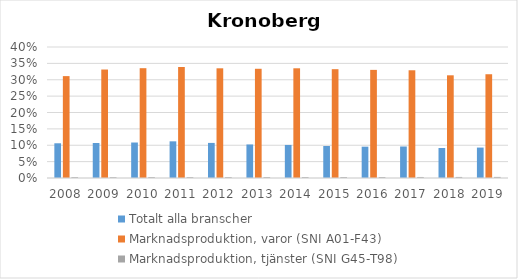
| Category | Totalt alla branscher | Marknadsproduktion, varor (SNI A01-F43) | Marknadsproduktion, tjänster (SNI G45-T98) |
|---|---|---|---|
| 2008.0 | 0.106 | 0.311 | 0.003 |
| 2009.0 | 0.107 | 0.331 | 0.003 |
| 2010.0 | 0.108 | 0.335 | 0.003 |
| 2011.0 | 0.112 | 0.339 | 0.003 |
| 2012.0 | 0.107 | 0.335 | 0.003 |
| 2013.0 | 0.102 | 0.334 | 0.003 |
| 2014.0 | 0.101 | 0.335 | 0.003 |
| 2015.0 | 0.098 | 0.332 | 0.003 |
| 2016.0 | 0.096 | 0.33 | 0.003 |
| 2017.0 | 0.096 | 0.329 | 0.003 |
| 2018.0 | 0.092 | 0.314 | 0.003 |
| 2019.0 | 0.093 | 0.317 | 0.003 |